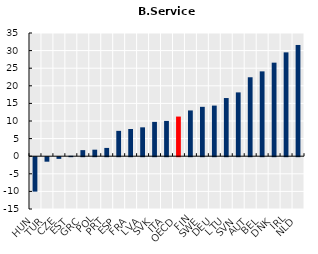
| Category | Series 0 |
|---|---|
| HUN | -9.775 |
| TUR | -1.275 |
| CZE | -0.475 |
| EST | 0.125 |
| GRC | 1.725 |
| POL | 1.85 |
| PRT | 2.35 |
| ESP | 7.2 |
| FRA | 7.725 |
| LVA | 8.2 |
| SVK | 9.75 |
| ITA | 10.025 |
| OECD | 11.258 |
| FIN | 13 |
| SWE | 14.025 |
| DEU | 14.375 |
| LTU | 16.525 |
| SVN | 18.125 |
| AUT | 22.425 |
| BEL | 24.1 |
| DNK | 26.575 |
| IRL | 29.5 |
| NLD | 31.6 |